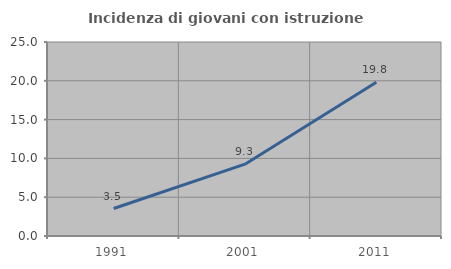
| Category | Incidenza di giovani con istruzione universitaria |
|---|---|
| 1991.0 | 3.54 |
| 2001.0 | 9.259 |
| 2011.0 | 19.82 |